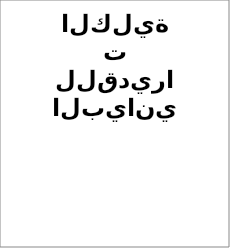
| Category | Series 0 | Series 1 |
|---|---|---|
| ممتاز مرتفع  | 0 |  |
| ممتاز   | 0 |  |
| جيد جدا مرتفع | 0 |  |
| جيد جدا  | 0 |  |
| جيد مرتفع  | 0 |  |
| جيد | 0 |  |
| مقبول مرتفع | 0 |  |
| مقبول   | 0 |  |
| راسب | 0 |  |
| محروم | 0 |  |